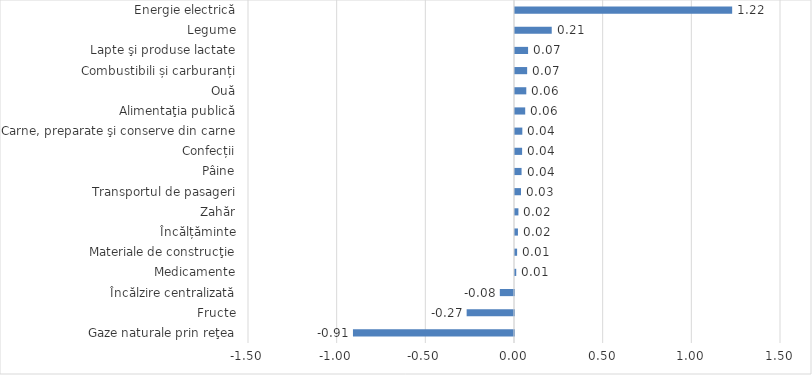
| Category | Series 0 |
|---|---|
|   Gaze naturale prin reţea | -0.908 |
| Fructe | -0.267 |
|   Încălzire centralizată | -0.08 |
| Medicamente | 0.007 |
| Materiale de construcţie | 0.012 |
| Încălțăminte | 0.017 |
| Zahăr | 0.019 |
| Transportul de pasageri | 0.034 |
| Pâine | 0.037 |
| Confecții | 0.04 |
| Carne, preparate şi conserve din carne | 0.041 |
| Alimentaţia publică | 0.058 |
| Ouă | 0.064 |
| Combustibili și carburanți | 0.069 |
| Lapte şi produse lactate | 0.074 |
| Legume | 0.207 |
|   Energie electrică | 1.225 |